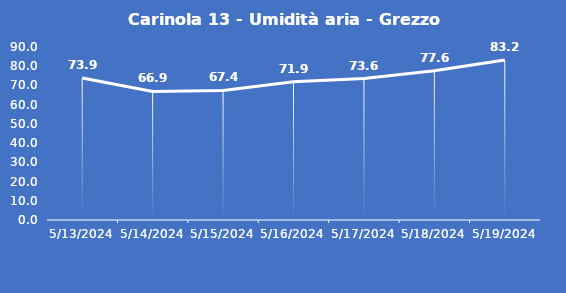
| Category | Carinola 13 - Umidità aria - Grezzo (%) |
|---|---|
| 5/13/24 | 73.9 |
| 5/14/24 | 66.9 |
| 5/15/24 | 67.4 |
| 5/16/24 | 71.9 |
| 5/17/24 | 73.6 |
| 5/18/24 | 77.6 |
| 5/19/24 | 83.2 |